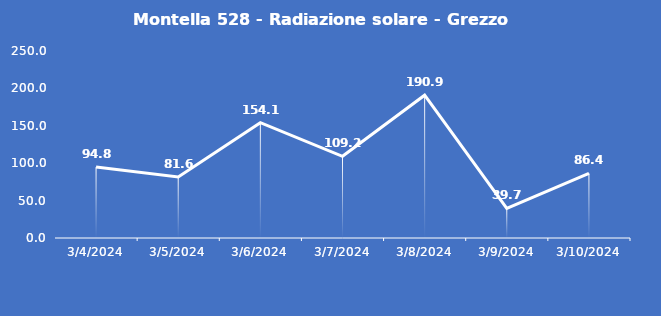
| Category | Montella 528 - Radiazione solare - Grezzo (W/m2) |
|---|---|
| 3/4/24 | 94.8 |
| 3/5/24 | 81.6 |
| 3/6/24 | 154.1 |
| 3/7/24 | 109.2 |
| 3/8/24 | 190.9 |
| 3/9/24 | 39.7 |
| 3/10/24 | 86.4 |